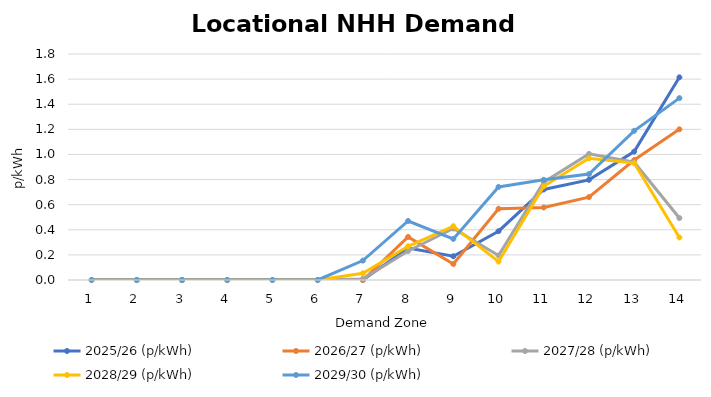
| Category | 2025/26 (p/kWh) | 2026/27 (p/kWh) | 2027/28 (p/kWh) | 2028/29 (p/kWh) | 2029/30 (p/kWh) |
|---|---|---|---|---|---|
| 1.0 | 0 | 0 | 0 | 0 | 0 |
| 2.0 | 0 | 0 | 0 | 0 | 0 |
| 3.0 | 0 | 0 | 0 | 0 | 0 |
| 4.0 | 0 | 0 | 0 | 0 | 0 |
| 5.0 | 0 | 0 | 0 | 0 | 0 |
| 6.0 | 0 | 0 | 0 | 0 | 0 |
| 7.0 | 0 | 0 | 0.009 | 0.054 | 0.155 |
| 8.0 | 0.254 | 0.343 | 0.231 | 0.269 | 0.47 |
| 9.0 | 0.189 | 0.127 | 0.41 | 0.428 | 0.327 |
| 10.0 | 0.389 | 0.568 | 0.195 | 0.147 | 0.741 |
| 11.0 | 0.721 | 0.578 | 0.779 | 0.746 | 0.798 |
| 12.0 | 0.798 | 0.66 | 1.004 | 0.969 | 0.843 |
| 13.0 | 1.023 | 0.955 | 0.938 | 0.931 | 1.188 |
| 14.0 | 1.614 | 1.2 | 0.494 | 0.339 | 1.449 |